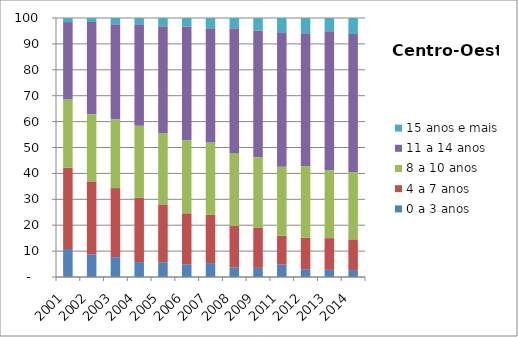
| Category | 0 a 3 anos | 4 a 7 anos | 8 a 10 anos | 11 a 14 anos | 15 anos e mais |
|---|---|---|---|---|---|
| 2001.0 | 10.79 | 31.43 | 26.32 | 29.9 | 1.57 |
| 2002.0 | 8.74 | 28.19 | 25.96 | 35.58 | 1.53 |
| 2003.0 | 7.66 | 26.67 | 26.54 | 36.73 | 2.39 |
| 2004.0 | 5.76 | 24.78 | 27.84 | 39.16 | 2.46 |
| 2005.0 | 5.73 | 22.31 | 27.6 | 41.16 | 3.2 |
| 2006.0 | 4.93 | 19.66 | 28.28 | 43.83 | 3.3 |
| 2007.0 | 5.36 | 18.62 | 27.94 | 44.09 | 4 |
| 2008.0 | 3.62 | 16.11 | 28.16 | 48.19 | 3.92 |
| 2009.0 | 3.52 | 15.61 | 27.06 | 49 | 4.82 |
| 2011.0 | 4.77 | 11.23 | 26.52 | 51.93 | 5.55 |
| 2012.0 | 3.01 | 12.14 | 27.68 | 51.26 | 5.9 |
| 2013.0 | 2.76 | 12.26 | 26.27 | 53.58 | 5.12 |
| 2014.0 | 2.67 | 11.88 | 25.97 | 53.32 | 6.16 |